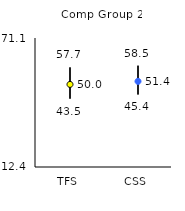
| Category | 25th | 75th | Mean |
|---|---|---|---|
| TFS | 43.5 | 57.7 | 49.98 |
| CSS | 45.4 | 58.5 | 51.37 |